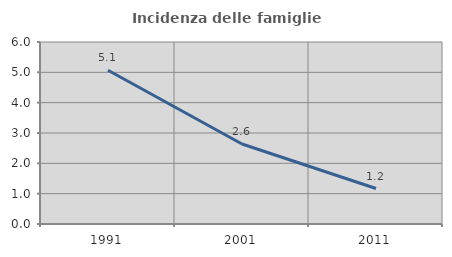
| Category | Incidenza delle famiglie numerose |
|---|---|
| 1991.0 | 5.07 |
| 2001.0 | 2.639 |
| 2011.0 | 1.17 |